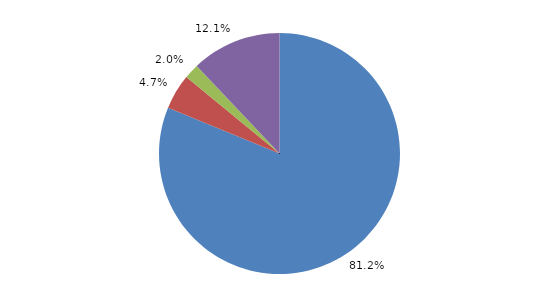
| Category | Series 0 |
|---|---|
| allgemeine Krankheit (einschließlich Impfschaden) | 166649 |
| angeborene Behinderung | 9696 |
| Unfälle1 | 4117 |
| sonstige, mehrere oder ungenügend bezeichnete Ursachen | 24733 |